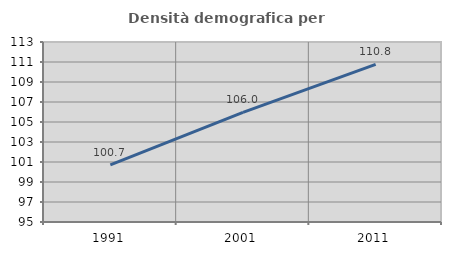
| Category | Densità demografica |
|---|---|
| 1991.0 | 100.711 |
| 2001.0 | 105.962 |
| 2011.0 | 110.766 |